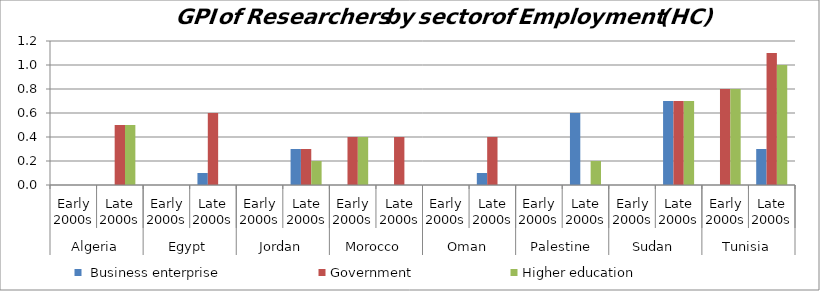
| Category |  Business enterprise | Government | Higher education |
|---|---|---|---|
| 0 | 0 | 0 | 0 |
| 1 | 0 | 0.5 | 0.5 |
| 2 | 0 | 0 | 0 |
| 3 | 0.1 | 0.6 | 0 |
| 4 | 0 | 0 | 0 |
| 5 | 0.3 | 0.3 | 0.2 |
| 6 | 0 | 0.4 | 0.4 |
| 7 | 0 | 0.4 | 0 |
| 8 | 0 | 0 | 0 |
| 9 | 0.1 | 0.4 | 0 |
| 10 | 0 | 0 | 0 |
| 11 | 0.6 | 0 | 0.2 |
| 12 | 0 | 0 | 0 |
| 13 | 0.7 | 0.7 | 0.7 |
| 14 | 0 | 0.8 | 0.8 |
| 15 | 0.3 | 1.1 | 1 |